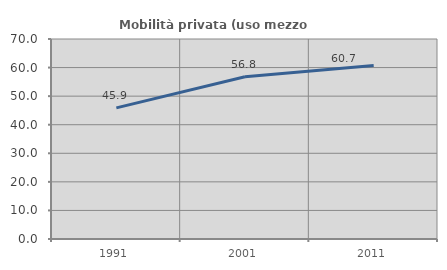
| Category | Mobilità privata (uso mezzo privato) |
|---|---|
| 1991.0 | 45.886 |
| 2001.0 | 56.77 |
| 2011.0 | 60.687 |